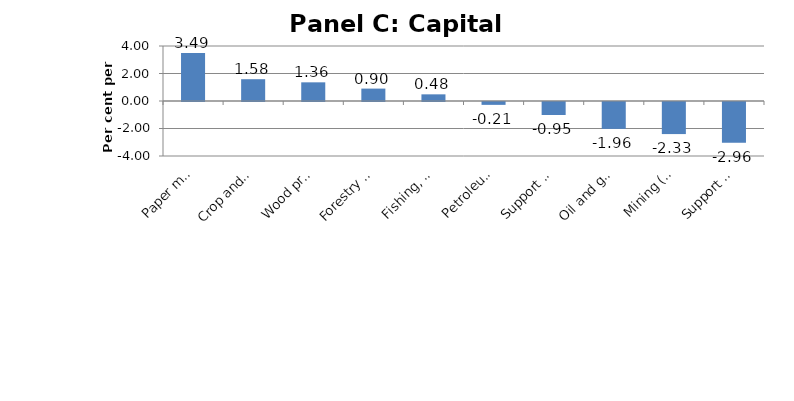
| Category | Series 0 |
|---|---|
| Paper manufacturing | 3.491 |
| Crop and animal production | 1.584 |
| Wood product manufacturing | 1.358 |
| Forestry and logging | 0.902 |
| Fishing, hunting and trapping | 0.484 |
| Petroleum and coal products manufacturing | -0.208 |
| Support activities for mining and oil and gas | -0.947 |
| Oil and gas extraction | -1.955 |
| Mining (except oil and gas) | -2.333 |
| Support activities for agriculture and forestry | -2.961 |